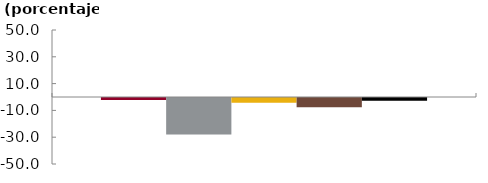
| Category | Bancos | CF | CFC | Coop | Sistema |
|---|---|---|---|---|---|
|  | -1.407 | -27.233 | -3.453 | -6.915 | -2.03 |